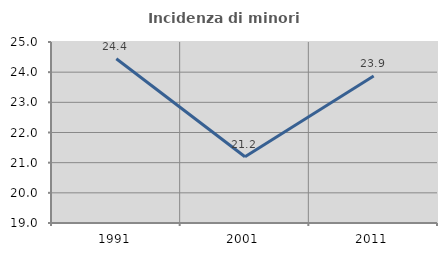
| Category | Incidenza di minori stranieri |
|---|---|
| 1991.0 | 24.444 |
| 2001.0 | 21.195 |
| 2011.0 | 23.872 |